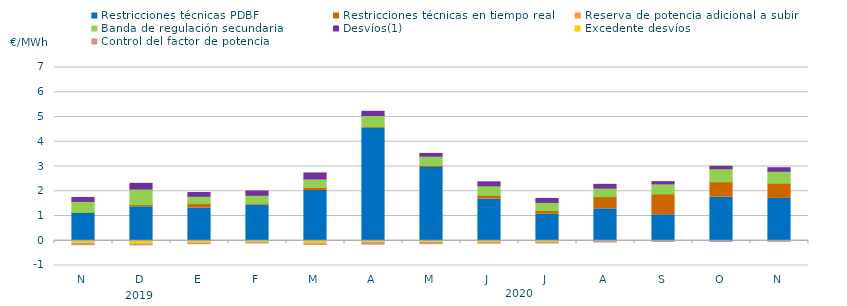
| Category | Restricciones técnicas PDBF | Restricciones técnicas en tiempo real | Reserva de potencia adicional a subir | Banda de regulación secundaria | Desvíos(1) | Excedente desvíos | Control del factor de potencia |
|---|---|---|---|---|---|---|---|
| N | 1.1 | 0.05 | 0 | 0.44 | 0.16 | -0.11 | -0.09 |
| D | 1.37 | 0.09 | 0 | 0.63 | 0.23 | -0.14 | -0.07 |
| E | 1.32 | 0.18 | 0 | 0.3 | 0.15 | -0.1 | -0.06 |
| F | 1.44 | 0.07 | 0 | 0.33 | 0.17 | -0.07 | -0.06 |
| M | 2.03 | 0.12 | 0 | 0.35 | 0.24 | -0.12 | -0.07 |
| A | 4.54 | 0.07 | 0 | 0.45 | 0.17 | -0.08 | -0.1 |
| M | 2.96 | 0.08 | 0 | 0.38 | 0.11 | -0.07 | -0.09 |
| J | 1.68 | 0.15 | 0 | 0.39 | 0.16 | -0.07 | -0.07 |
| J | 1.07 | 0.15 | 0 | 0.33 | 0.16 | -0.07 | -0.06 |
| A | 1.29 | 0.49 | 0 | 0.35 | 0.15 | -0.03 | -0.06 |
| S | 1.05 | 0.84 | 0 | 0.41 | 0.09 | -0.01 | -0.06 |
| O | 1.76 | 0.62 | 0 | 0.53 | 0.1 | 0 | -0.07 |
| N | 1.71 | 0.61 | 0 | 0.49 | 0.14 | -0.01 | -0.05 |